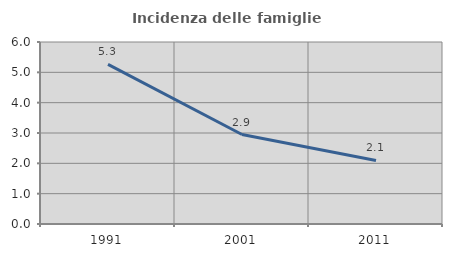
| Category | Incidenza delle famiglie numerose |
|---|---|
| 1991.0 | 5.263 |
| 2001.0 | 2.95 |
| 2011.0 | 2.096 |